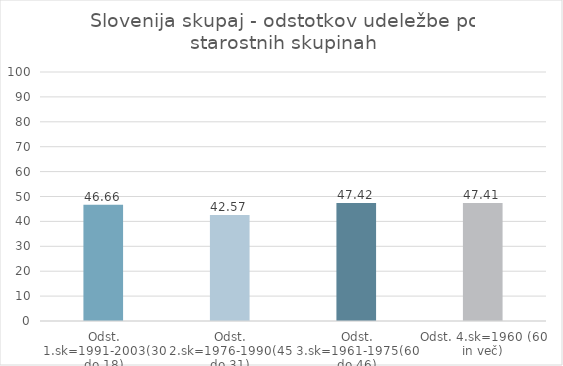
| Category | Series 0 |
|---|---|
| Odst. 1.sk=1991-2003(30 do 18) | 46.66 |
| Odst. 2.sk=1976-1990(45 do 31) | 42.57 |
| Odst. 3.sk=1961-1975(60 do 46) | 47.42 |
| Odst. 4.sk=1960 (60 in več) | 47.41 |